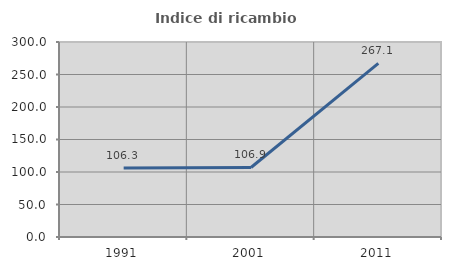
| Category | Indice di ricambio occupazionale  |
|---|---|
| 1991.0 | 106.25 |
| 2001.0 | 106.944 |
| 2011.0 | 267.123 |